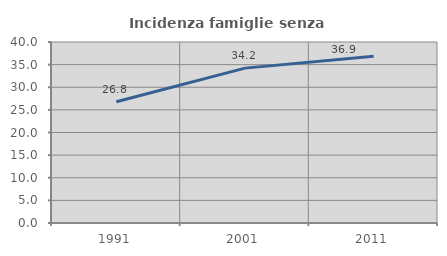
| Category | Incidenza famiglie senza nuclei |
|---|---|
| 1991.0 | 26.812 |
| 2001.0 | 34.227 |
| 2011.0 | 36.853 |